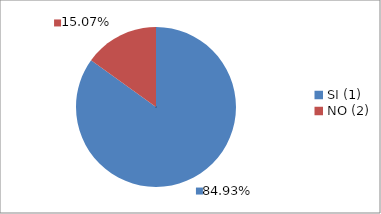
| Category | Series 0 |
|---|---|
| SI (1) | 0.849 |
| NO (2) | 0.151 |